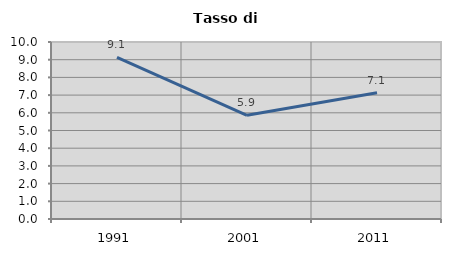
| Category | Tasso di disoccupazione   |
|---|---|
| 1991.0 | 9.13 |
| 2001.0 | 5.856 |
| 2011.0 | 7.138 |